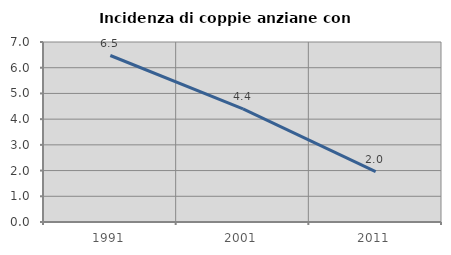
| Category | Incidenza di coppie anziane con figli |
|---|---|
| 1991.0 | 6.475 |
| 2001.0 | 4.401 |
| 2011.0 | 1.961 |